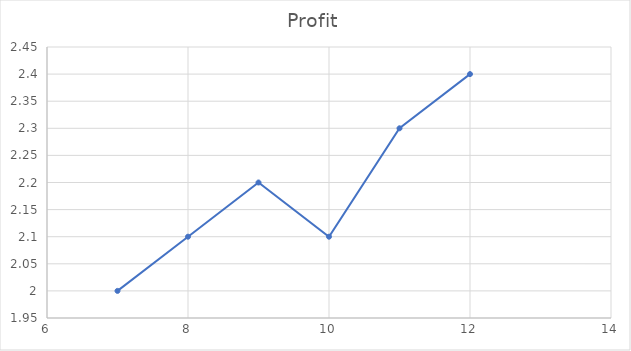
| Category | Profit |
|---|---|
| 7.0 | 2 |
| 8.0 | 2.1 |
| 9.0 | 2.2 |
| 10.0 | 2.1 |
| 11.0 | 2.3 |
| 12.0 | 2.4 |